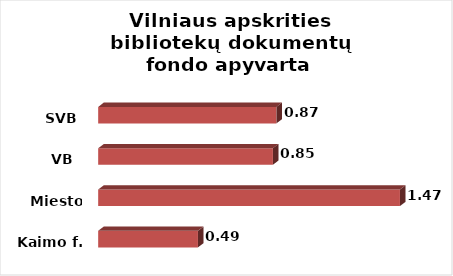
| Category | Series 0 |
|---|---|
| Kaimo f. | 0.487 |
| Miesto f. | 1.473 |
| VB  | 0.853 |
| SVB | 0.87 |